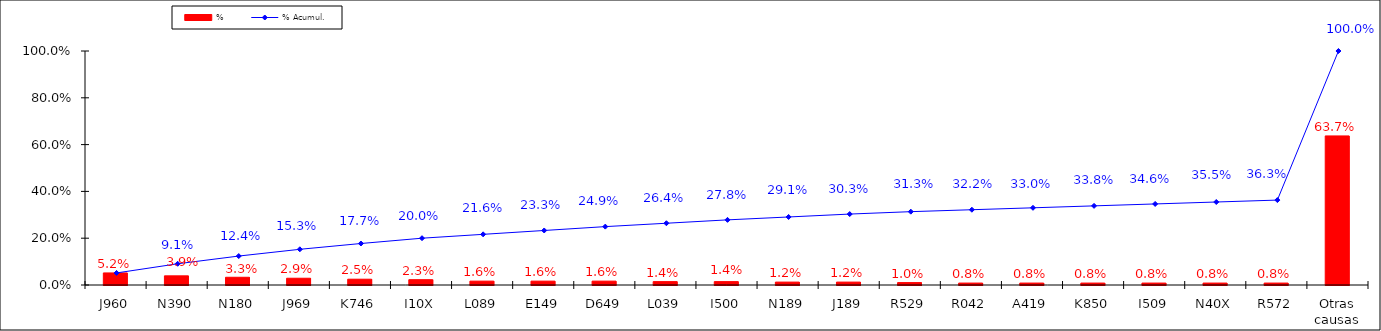
| Category | % |
|---|---|
| J960 | 0.052 |
| N390 | 0.039 |
| N180 | 0.033 |
| J969 | 0.029 |
| K746 | 0.025 |
| I10X | 0.023 |
| L089 | 0.016 |
| E149 | 0.016 |
| D649 | 0.016 |
| L039 | 0.014 |
| I500 | 0.014 |
| N189 | 0.012 |
| J189 | 0.012 |
| R529 | 0.01 |
| R042 | 0.008 |
| A419 | 0.008 |
| K850 | 0.008 |
| I509 | 0.008 |
| N40X | 0.008 |
| R572 | 0.008 |
| Otras causas | 0.637 |